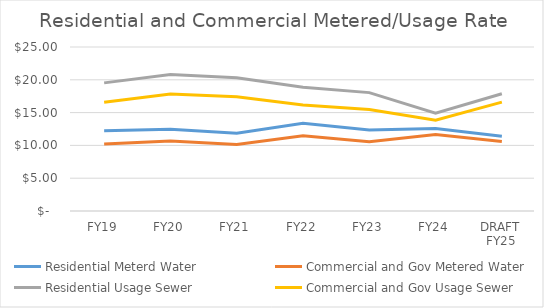
| Category | Residential Meterd Water | Commercial and Gov Metered Water | Residential Usage Sewer | Commercial and Gov Usage Sewer |
|---|---|---|---|---|
| FY19 | 12.24 | 10.23 | 19.53 | 16.57 |
| FY20 | 12.45 | 10.671 | 20.803 | 17.831 |
| FY21 | 11.848 | 10.156 | 20.317 | 17.415 |
| FY22 | 13.389 | 11.476 | 18.87 | 16.175 |
| FY23 | 12.335 | 10.572 | 18.045 | 15.467 |
| FY24 | 12.574 | 11.676 | 14.919 | 13.853 |
| DRAFT FY25 | 11.4 | 10.59 | 17.87 | 16.59 |